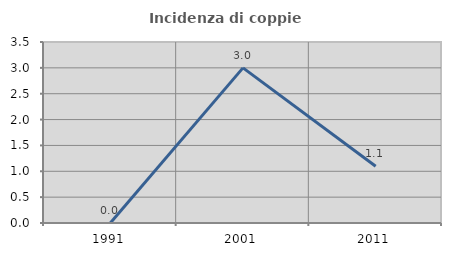
| Category | Incidenza di coppie miste |
|---|---|
| 1991.0 | 0 |
| 2001.0 | 3 |
| 2011.0 | 1.099 |